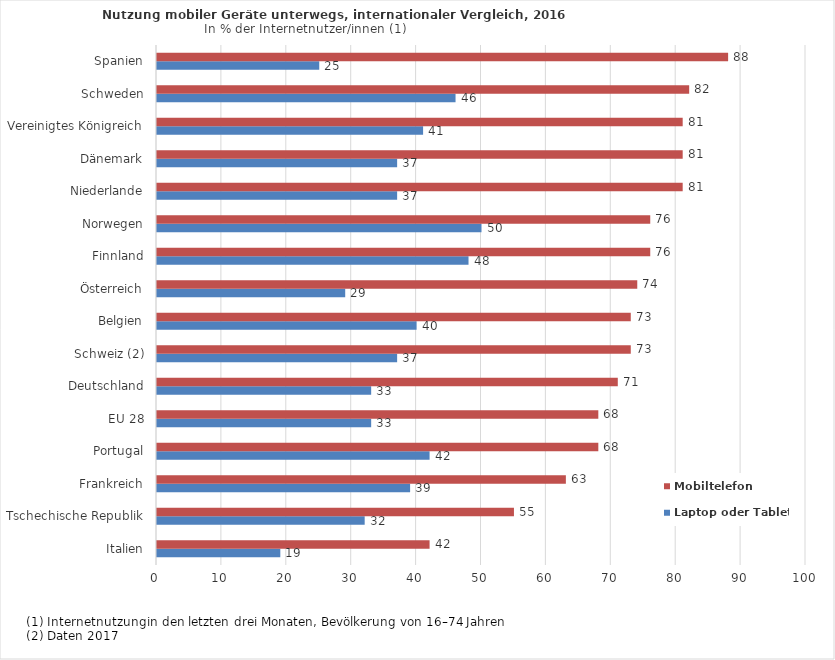
| Category | Laptop oder Tablet | Mobiltelefon |
|---|---|---|
| Italien | 19 | 42 |
| Tschechische Republik | 32 | 55 |
| Frankreich | 39 | 63 |
| Portugal | 42 | 68 |
| EU 28 | 33 | 68 |
| Deutschland | 33 | 71 |
| Schweiz (2) | 37 | 73 |
| Belgien | 40 | 73 |
| Österreich | 29 | 74 |
| Finnland | 48 | 76 |
| Norwegen | 50 | 76 |
| Niederlande | 37 | 81 |
| Dänemark | 37 | 81 |
| Vereinigtes Königreich | 41 | 81 |
| Schweden | 46 | 82 |
| Spanien | 25 | 88 |